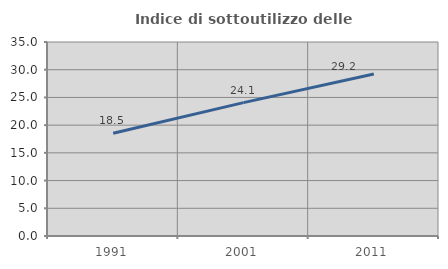
| Category | Indice di sottoutilizzo delle abitazioni  |
|---|---|
| 1991.0 | 18.547 |
| 2001.0 | 24.057 |
| 2011.0 | 29.241 |